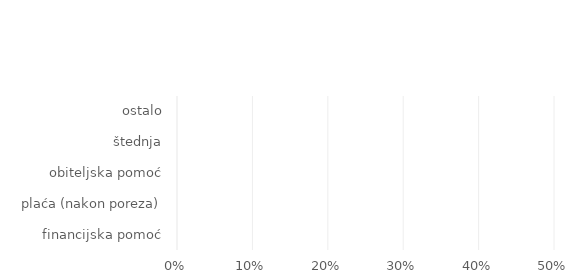
| Category | Series 0 |
|---|---|
| financijska pomoć | 0 |
| plaća (nakon poreza) | 0 |
| obiteljska pomoć | 0 |
| štednja | 0 |
| ostalo | 0 |